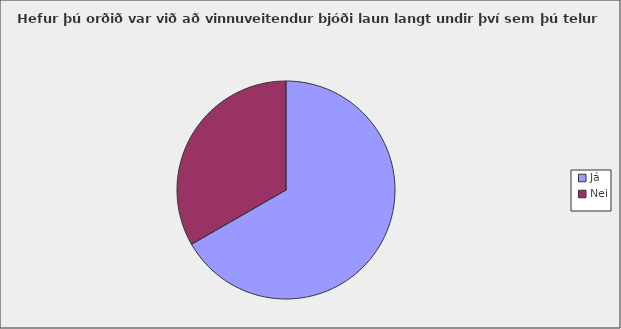
| Category | Series 0 |
|---|---|
| Já | 0.667 |
| Nei | 0.333 |